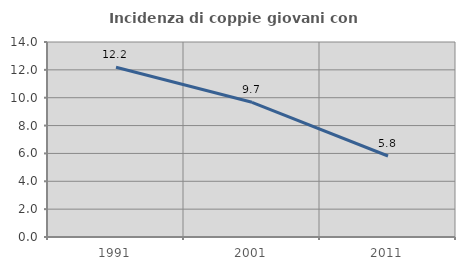
| Category | Incidenza di coppie giovani con figli |
|---|---|
| 1991.0 | 12.184 |
| 2001.0 | 9.672 |
| 2011.0 | 5.816 |